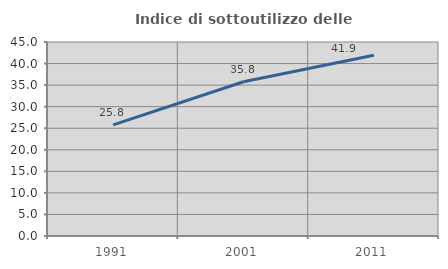
| Category | Indice di sottoutilizzo delle abitazioni  |
|---|---|
| 1991.0 | 25.786 |
| 2001.0 | 35.783 |
| 2011.0 | 41.923 |